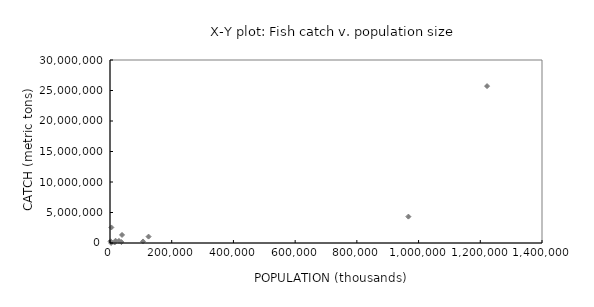
| Category | Total fish catch (MT) |
|---|---|
| 125000.0 | 1047170 |
| 15000.0 | 80000 |
| 1222000.0 | 25721740 |
| 37000.0 | 146407 |
| 3600.0 | 3826 |
| 18000.0 | 371227 |
| 967000.0 | 4324235 |
| 1700.0 | 285980 |
| 107000.0 | 255499 |
| 4400.0 | 2550894 |
| 39000.0 | 1320000 |
| 29000.0 | 345000 |